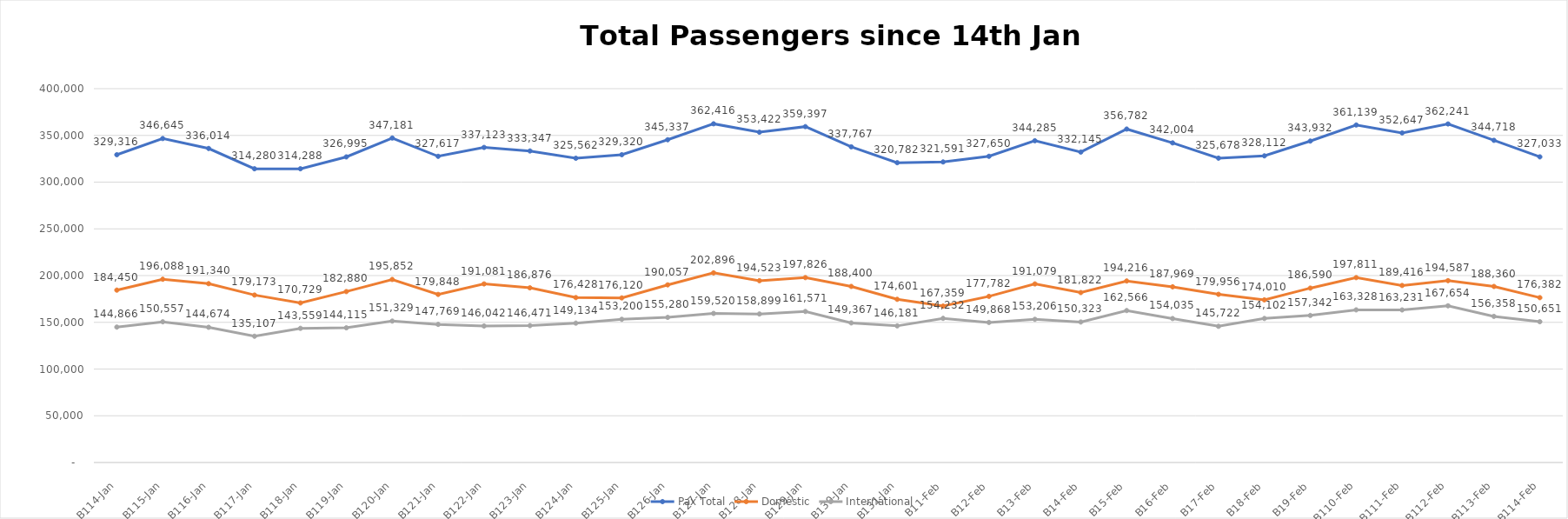
| Category | Pax Total |  Domestic  |  International  |
|---|---|---|---|
| 2023-01-14 | 329316 | 184450 | 144866 |
| 2023-01-15 | 346645 | 196088 | 150557 |
| 2023-01-16 | 336014 | 191340 | 144674 |
| 2023-01-17 | 314280 | 179173 | 135107 |
| 2023-01-18 | 314288 | 170729 | 143559 |
| 2023-01-19 | 326995 | 182880 | 144115 |
| 2023-01-20 | 347181 | 195852 | 151329 |
| 2023-01-21 | 327617 | 179848 | 147769 |
| 2023-01-22 | 337123 | 191081 | 146042 |
| 2023-01-23 | 333347 | 186876 | 146471 |
| 2023-01-24 | 325562 | 176428 | 149134 |
| 2023-01-25 | 329320 | 176120 | 153200 |
| 2023-01-26 | 345337 | 190057 | 155280 |
| 2023-01-27 | 362416 | 202896 | 159520 |
| 2023-01-28 | 353422 | 194523 | 158899 |
| 2023-01-29 | 359397 | 197826 | 161571 |
| 2023-01-30 | 337767 | 188400 | 149367 |
| 2023-01-31 | 320782 | 174601 | 146181 |
| 2023-02-01 | 321591 | 167359 | 154232 |
| 2023-02-02 | 327650 | 177782 | 149868 |
| 2023-02-03 | 344285 | 191079 | 153206 |
| 2023-02-04 | 332145 | 181822 | 150323 |
| 2023-02-05 | 356782 | 194216 | 162566 |
| 2023-02-06 | 342004 | 187969 | 154035 |
| 2023-02-07 | 325678 | 179956 | 145722 |
| 2023-02-08 | 328112 | 174010 | 154102 |
| 2023-02-09 | 343932 | 186590 | 157342 |
| 2023-02-10 | 361139 | 197811 | 163328 |
| 2023-02-11 | 352647 | 189416 | 163231 |
| 2023-02-12 | 362241 | 194587 | 167654 |
| 2023-02-13 | 344718 | 188360 | 156358 |
| 2023-02-14 | 327033 | 176382 | 150651 |